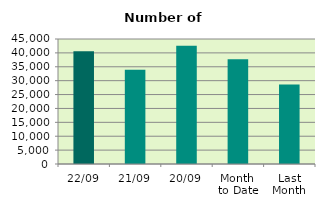
| Category | Series 0 |
|---|---|
| 22/09 | 40598 |
| 21/09 | 33958 |
| 20/09 | 42542 |
| Month 
to Date | 37685.125 |
| Last
Month | 28637.636 |